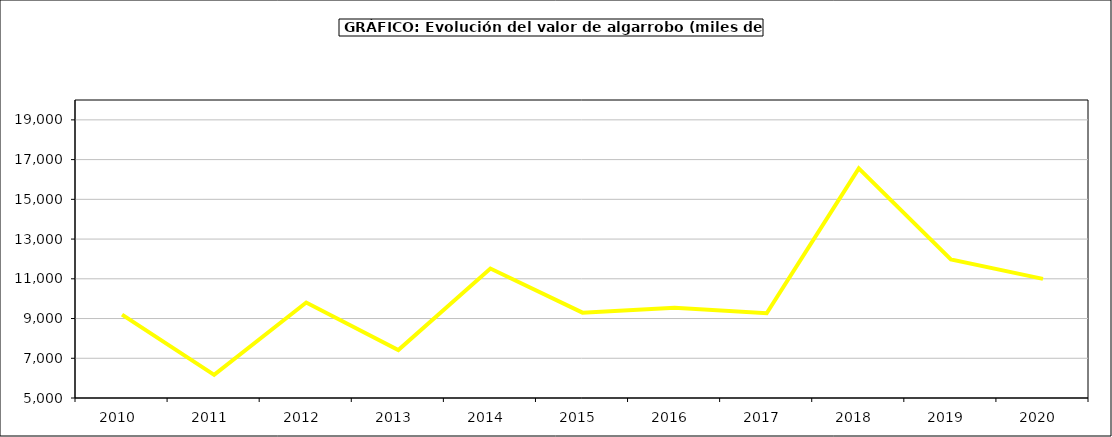
| Category | producción |
|---|---|
| 2010.0 | 9197.132 |
| 2011.0 | 6163.828 |
| 2012.0 | 9804.883 |
| 2013.0 | 7410.909 |
| 2014.0 | 11518 |
| 2015.0 | 9297 |
| 2016.0 | 9540 |
| 2017.0 | 9266.566 |
| 2018.0 | 16561.827 |
| 2019.0 | 11974.589 |
| 2020.0 | 10995.99 |